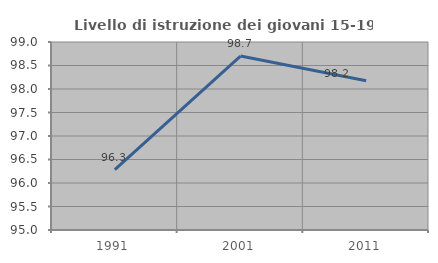
| Category | Livello di istruzione dei giovani 15-19 anni |
|---|---|
| 1991.0 | 96.283 |
| 2001.0 | 98.701 |
| 2011.0 | 98.174 |